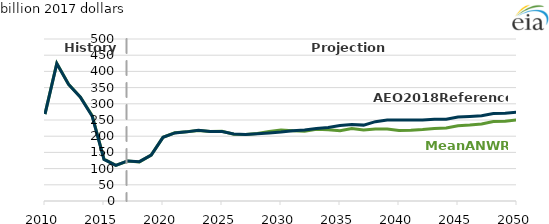
| Category | Mean  ANWR | AEO2018 Reference  |
|---|---|---|
| 2010.0 | 268.251 | 268.251 |
| 2011.0 | 424.545 | 424.014 |
| 2012.0 | 360.301 | 359.756 |
| 2013.0 | 320.774 | 320.388 |
| 2014.0 | 263.75 | 261.539 |
| 2015.0 | 129.06 | 128.313 |
| 2016.0 | 109.782 | 109.703 |
| 2017.0 | 123.537 | 123.578 |
| 2018.0 | 120.735 | 121.449 |
| 2019.0 | 141.728 | 141.876 |
| 2020.0 | 196.568 | 196.525 |
| 2021.0 | 210.46 | 210.227 |
| 2022.0 | 213.654 | 213.386 |
| 2023.0 | 217.777 | 218.162 |
| 2024.0 | 214.453 | 214.393 |
| 2025.0 | 215.163 | 214.721 |
| 2026.0 | 206.346 | 207.137 |
| 2027.0 | 204.967 | 205.545 |
| 2028.0 | 208.049 | 207.696 |
| 2029.0 | 214.756 | 209.932 |
| 2030.0 | 219.389 | 212.722 |
| 2031.0 | 216.524 | 217.14 |
| 2032.0 | 215.133 | 219.346 |
| 2033.0 | 221.188 | 223.974 |
| 2034.0 | 219.782 | 227.046 |
| 2035.0 | 216.58 | 232.936 |
| 2036.0 | 223.628 | 235.844 |
| 2037.0 | 219.088 | 234.207 |
| 2038.0 | 222.296 | 244.808 |
| 2039.0 | 221.945 | 250.003 |
| 2040.0 | 217.688 | 249.817 |
| 2041.0 | 218.604 | 250.151 |
| 2042.0 | 220.655 | 249.715 |
| 2043.0 | 223.517 | 252.363 |
| 2044.0 | 225.482 | 252.094 |
| 2045.0 | 232.399 | 258.901 |
| 2046.0 | 234.447 | 260.793 |
| 2047.0 | 237.633 | 263.018 |
| 2048.0 | 245.012 | 270.176 |
| 2049.0 | 246.325 | 270.761 |
| 2050.0 | 250.526 | 274.077 |